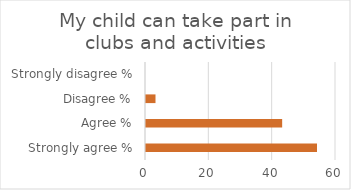
| Category | Series 1 |
|---|---|
| Strongly agree % | 54 |
| Agree % | 43 |
| Disagree % | 3 |
| Strongly disagree % | 0 |